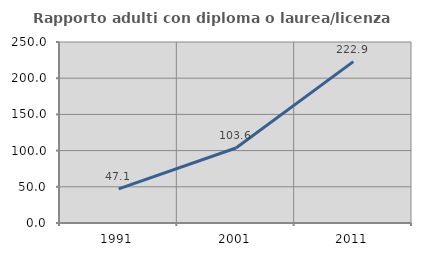
| Category | Rapporto adulti con diploma o laurea/licenza media  |
|---|---|
| 1991.0 | 47.059 |
| 2001.0 | 103.604 |
| 2011.0 | 222.917 |